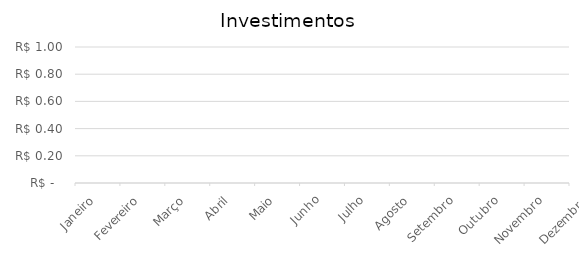
| Category | Investimentos |
|---|---|
| Janeiro | 0 |
| Fevereiro | 0 |
| Março | 0 |
| Abril | 0 |
| Maio | 0 |
| Junho | 0 |
| Julho | 0 |
| Agosto | 0 |
| Setembro | 0 |
| Outubro | 0 |
| Novembro | 0 |
| Dezembro | 0 |